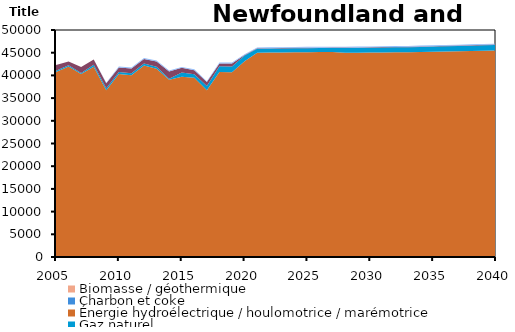
| Category | Biomasse / géothermique | Charbon et coke | Énergie hydroélectrique / houlomotrice / marémotrice | Gaz naturel | Pétrole | Solaire | Uranium | Éolien |
|---|---|---|---|---|---|---|---|---|
| 2005.0 | 0 | 0 | 40741.37 | 267.071 | 1306.213 | 0 | 0 | 0 |
| 2006.0 | 0 | 0 | 41953.37 | 277.824 | 823.061 | 0 | 0 | 0 |
| 2007.0 | 0 | 0 | 40291.38 | 236.767 | 1305.518 | 0 | 0 | 0 |
| 2008.0 | 0 | 0 | 41897.25 | 456.938 | 1139.063 | 0 | 0 | 0 |
| 2009.0 | 0 | 0 | 36728 | 447.622 | 1121.594 | 0 | 0 | 102 |
| 2010.0 | 0 | 0 | 40286.8 | 454.971 | 1017.228 | 0 | 0 | 183 |
| 2011.0 | 0 | 0 | 40033.37 | 449.291 | 1039.361 | 0 | 0 | 198 |
| 2012.0 | 0 | 0 | 42202.52 | 418.805 | 998.926 | 0 | 0 | 195 |
| 2013.0 | 0 | 0 | 41441.68 | 444.364 | 1179.715 | 0 | 0 | 192 |
| 2014.0 | 0 | 0 | 39047.83 | 239.4 | 1589.8 | 0 | 0 | 176.963 |
| 2015.0 | 0 | 0 | 39685.86 | 955.497 | 1025.604 | 0 | 0 | 172.392 |
| 2016.0 | 0 | 0 | 39482.84 | 750.43 | 924.37 | 0 | 0 | 189.997 |
| 2017.0 | 0 | 0 | 36738.97 | 953.422 | 839.478 | 0 | 0 | 186.418 |
| 2018.0 | 0 | 0 | 40723.2 | 1275.726 | 648.297 | 0 | 0 | 186.02 |
| 2019.0 | 0 | 0 | 40711.32 | 1273.104 | 643.584 | 0 | 0 | 186.019 |
| 2020.0 | 0 | 0 | 43141.63 | 1218.53 | 114.891 | 0 | 0 | 185.992 |
| 2021.0 | 0 | 0 | 44994.41 | 866.537 | 94.573 | 0 | 0 | 185.817 |
| 2022.0 | 0 | 0 | 45026.67 | 873.2 | 94.958 | 0 | 0 | 185.82 |
| 2023.0 | 0 | 0 | 45059.05 | 879.711 | 95.334 | 0 | 0 | 185.824 |
| 2024.0 | 0 | 0 | 45083.72 | 884.468 | 95.608 | 0 | 0 | 185.826 |
| 2025.0 | 0 | 0 | 45115.45 | 890.774 | 95.972 | 0 | 0 | 185.829 |
| 2026.0 | 0 | 0 | 45127.88 | 893.155 | 96.11 | 0 | 0 | 185.83 |
| 2027.0 | 0 | 0 | 45143.43 | 896.454 | 96.3 | 0 | 0 | 185.832 |
| 2028.0 | 0 | 0 | 44981.8 | 1071.749 | 94.441 | 0 | 0 | 185.816 |
| 2029.0 | 0 | 0 | 44999.18 | 1076.314 | 94.653 | 0 | 0 | 185.818 |
| 2030.0 | 0 | 0 | 45017.13 | 1080.975 | 94.87 | 0 | 0 | 185.82 |
| 2031.0 | 0 | 0 | 45046.13 | 1088.125 | 95.203 | 0 | 0 | 185.823 |
| 2032.0 | 0 | 0 | 45078.86 | 1096.135 | 95.576 | 0 | 0 | 185.826 |
| 2033.0 | 0 | 0 | 45115.8 | 1105.166 | 95.996 | 0 | 0 | 185.83 |
| 2034.0 | 0 | 0 | 45161.88 | 1116.574 | 96.528 | 0 | 0 | 185.834 |
| 2035.0 | 0 | 0 | 45210.54 | 1128.518 | 97.083 | 0 | 0 | 185.839 |
| 2036.0 | 0 | 0 | 45269.96 | 1143.248 | 97.769 | 0 | 0 | 185.845 |
| 2037.0 | 0 | 0 | 45321.77 | 1156.033 | 98.364 | 0 | 0 | 185.85 |
| 2038.0 | 0 | 0 | 45381.1 | 1170.792 | 102.511 | 0 | 0 | 185.856 |
| 2039.0 | 0 | 0 | 45437.46 | 1184.869 | 103.279 | 0 | 0 | 185.861 |
| 2040.0 | 0 | 0 | 45480.7 | 1195.772 | 107.762 | 0 | 0 | 185.866 |